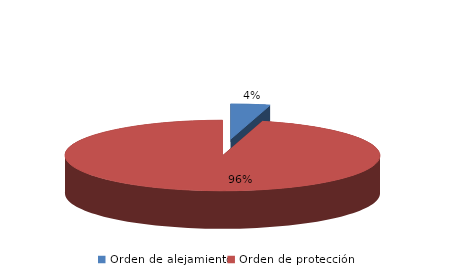
| Category | Series 0 |
|---|---|
| Orden de alejamiento | 7 |
| Orden de protección | 166 |